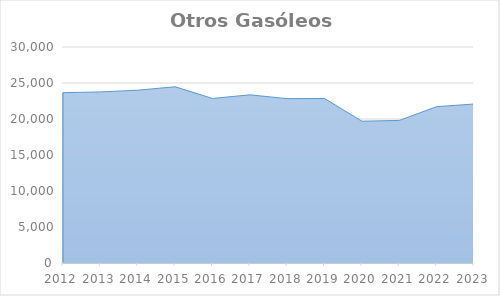
| Category | Otros Gasóleos |
|---|---|
| 2012.0 | 23655.098 |
| 2013.0 | 23759.561 |
| 2014.0 | 23998.256 |
| 2015.0 | 24477.329 |
| 2016.0 | 22853.852 |
| 2017.0 | 23356.296 |
| 2018.0 | 22827.504 |
| 2019.0 | 22851.346 |
| 2020.0 | 19692.742 |
| 2021.0 | 19803.856 |
| 2022.0 | 21713.007 |
| 2023.0 | 22082.314 |